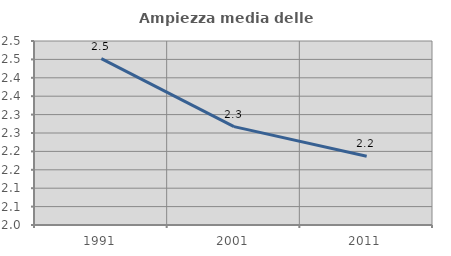
| Category | Ampiezza media delle famiglie |
|---|---|
| 1991.0 | 2.452 |
| 2001.0 | 2.267 |
| 2011.0 | 2.187 |